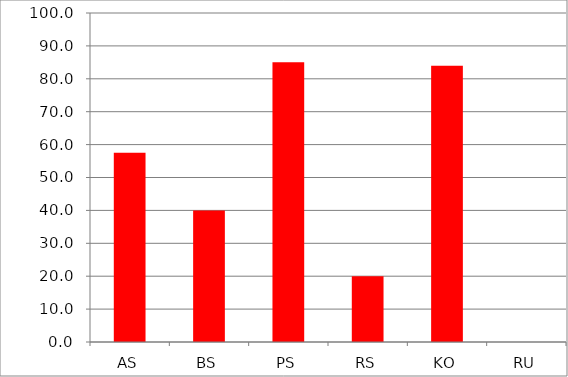
| Category | Series 0 |
|---|---|
| AS | 57.5 |
| BS | 40 |
| PS | 85 |
| RS | 20 |
| KO | 84 |
| RU | 0 |